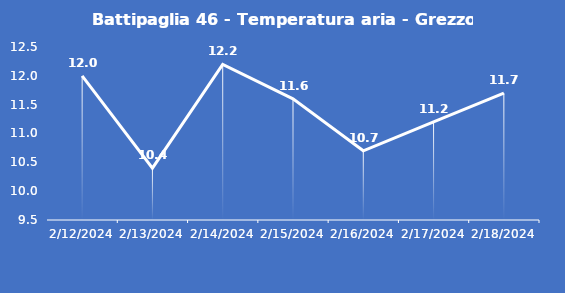
| Category | Battipaglia 46 - Temperatura aria - Grezzo (°C) |
|---|---|
| 2/12/24 | 12 |
| 2/13/24 | 10.4 |
| 2/14/24 | 12.2 |
| 2/15/24 | 11.6 |
| 2/16/24 | 10.7 |
| 2/17/24 | 11.2 |
| 2/18/24 | 11.7 |